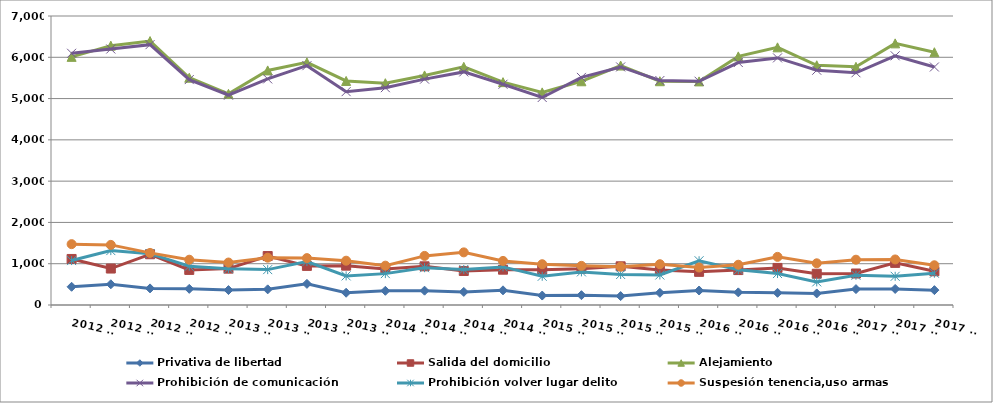
| Category | Privativa de libertad | Salida del domicilio | Alejamiento | Prohibición de comunicación | Prohibición volver lugar delito | Suspesión tenencia,uso armas |
|---|---|---|---|---|---|---|
| 2012 T1 | 441 | 1115 | 6010 | 6097 | 1076 | 1474 |
| 2012 T2 | 502 | 883 | 6282 | 6201 | 1318 | 1456 |
| 2012 T3 | 402 | 1229 | 6393 | 6306 | 1244 | 1262 |
| 2012 T4 | 391 | 850 | 5505 | 5460 | 938 | 1097 |
| 2013 T1 | 362 | 881 | 5114 | 5082 | 878 | 1029 |
| 2013 T2 | 379 | 1186 | 5682 | 5476 | 857 | 1146 |
| 2013 T3 | 512 | 947 | 5877 | 5797 | 1053 | 1136 |
| 2013 T4 | 297 | 953 | 5427 | 5168 | 705 | 1073 |
| 2014 T1 | 344 | 873 | 5372 | 5264 | 760 | 953 |
| 2014 T2 | 347 | 937 | 5561 | 5471 | 903 | 1189 |
| 2014 T3 | 317 | 824 | 5769 | 5646 | 860 | 1275 |
| 2014 T4 | 355 | 855 | 5398 | 5347 | 923 | 1068 |
| 2015 T1 | 229 | 853 | 5150 | 5026 | 695 | 988 |
| 2015 T2 | 238 | 877 | 5419 | 5513 | 802 | 948 |
| 2015 T3 | 216 | 937 | 5800 | 5766 | 739 | 929 |
| 2015 T4 | 295 | 846 | 5420 | 5437 | 727 | 988 |
| 2016 T1 | 351 | 803 | 5416 | 5420 | 1072 | 908 |
| 2016 T2 | 306 | 846 | 6022 | 5873 | 852 | 975 |
| 2016 T3 | 295 | 898 | 6241 | 5985 | 762 | 1166 |
| 2016 T4 | 280 | 757 | 5807 | 5686 | 560 | 1010 |
| 2017 T1 | 385 | 763 | 5769 | 5625 | 720 | 1097 |
| 2017 T2 | 389 | 1020 | 6337 | 6036 | 695 | 1103 |
| 2017 T3 | 360 | 817 | 6122 | 5765 | 770 | 963 |